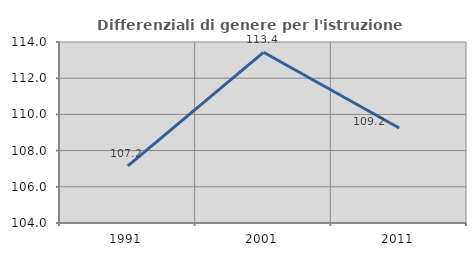
| Category | Differenziali di genere per l'istruzione superiore |
|---|---|
| 1991.0 | 107.152 |
| 2001.0 | 113.431 |
| 2011.0 | 109.245 |